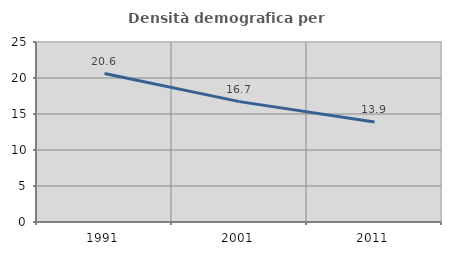
| Category | Densità demografica |
|---|---|
| 1991.0 | 20.623 |
| 2001.0 | 16.721 |
| 2011.0 | 13.902 |